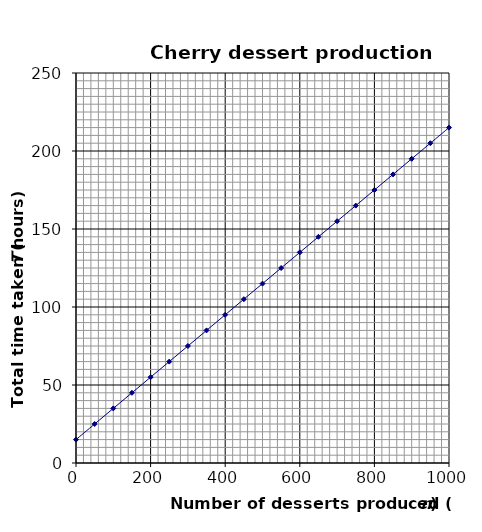
| Category | Series 0 |
|---|---|
| 0.0 | 15 |
| 50.0 | 25 |
| 100.0 | 35 |
| 150.0 | 45 |
| 200.0 | 55 |
| 250.0 | 65 |
| 300.0 | 75 |
| 350.0 | 85 |
| 400.0 | 95 |
| 450.0 | 105 |
| 500.0 | 115 |
| 550.0 | 125 |
| 600.0 | 135 |
| 650.0 | 145 |
| 700.0 | 155 |
| 750.0 | 165 |
| 800.0 | 175 |
| 850.0 | 185 |
| 900.0 | 195 |
| 950.0 | 205 |
| 1000.0 | 215 |